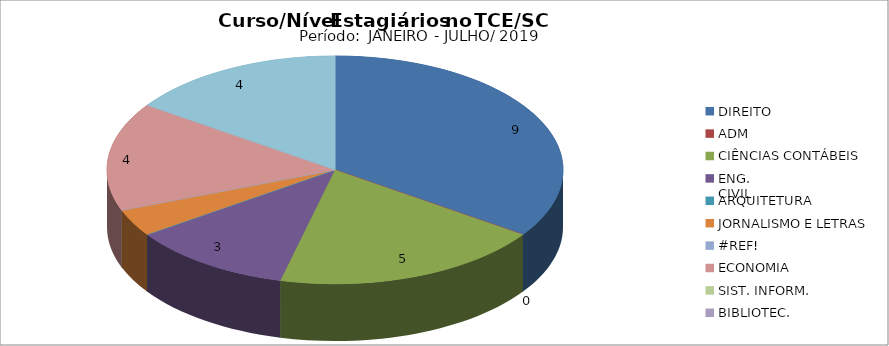
| Category | Series 0 |
|---|---|
| DIREITO | 9 |
| ADM | 0 |
| CIÊNCIAS CONTÁBEIS | 5 |
| ENG.
CIVIL | 3 |
| ARQUITETURA | 0 |
| JORNALISMO E LETRAS | 1 |
| #REF! | 0 |
| ECONOMIA | 4 |
| SIST. INFORM. | 0 |
| BIBLIOTEC. | 0 |
| NÍVEL
MÉDIO  | 4 |